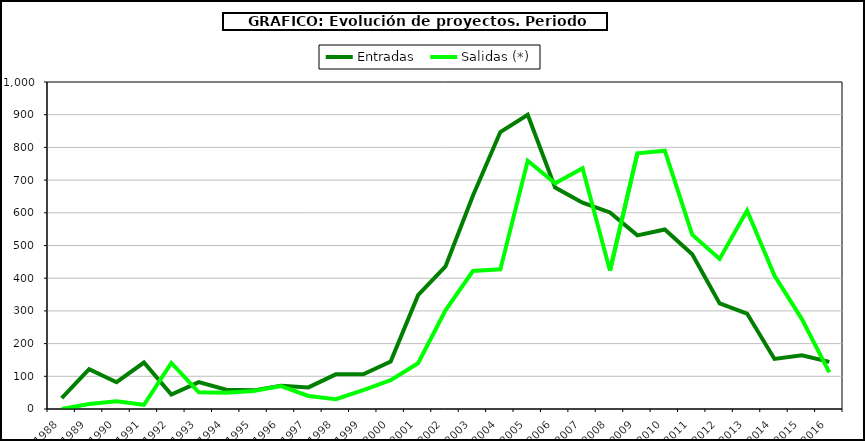
| Category | Entradas | Salidas (*) |
|---|---|---|
| 1988.0 | 33 | 0 |
| 1989.0 | 122 | 15 |
| 1990.0 | 82 | 24 |
| 1991.0 | 142 | 13 |
| 1992.0 | 44 | 141 |
| 1993.0 | 82 | 51 |
| 1994.0 | 59 | 50 |
| 1995.0 | 57 | 55 |
| 1996.0 | 71 | 70 |
| 1997.0 | 66 | 40 |
| 1998.0 | 106 | 30 |
| 1999.0 | 106 | 58 |
| 2000.0 | 145 | 88 |
| 2001.0 | 348 | 140 |
| 2002.0 | 436 | 302 |
| 2003.0 | 652 | 422 |
| 2004.0 | 847 | 427 |
| 2005.0 | 900 | 759 |
| 2006.0 | 677 | 690 |
| 2007.0 | 631 | 736 |
| 2008.0 | 601 | 423 |
| 2009.0 | 531 | 782 |
| 2010.0 | 549 | 790 |
| 2011.0 | 473 | 533 |
| 2012.0 | 323 | 459 |
| 2013.0 | 292 | 607 |
| 2014.0 | 153 | 408 |
| 2015.0 | 164 | 275 |
| 2016.0 | 144 | 112 |